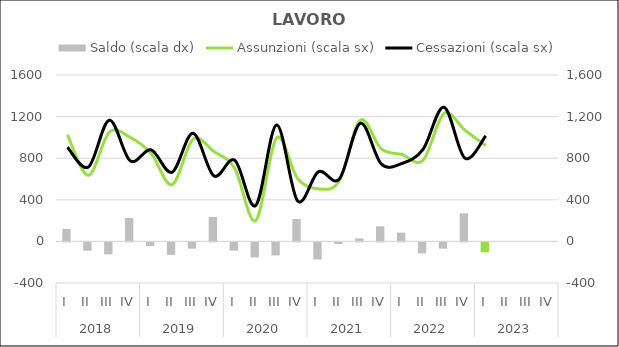
| Category | Saldo (scala dx) |
|---|---|
| 0 | 120 |
| 1 | -80 |
| 2 | -115 |
| 3 | 225 |
| 4 | -35 |
| 5 | -120 |
| 6 | -60 |
| 7 | 235 |
| 8 | -80 |
| 9 | -145 |
| 10 | -125 |
| 11 | 215 |
| 12 | -165 |
| 13 | -15 |
| 14 | 30 |
| 15 | 145 |
| 16 | 85 |
| 17 | -105 |
| 18 | -60 |
| 19 | 270 |
| 20 | -95 |
| 21 | 0 |
| 22 | 0 |
| 23 | 0 |